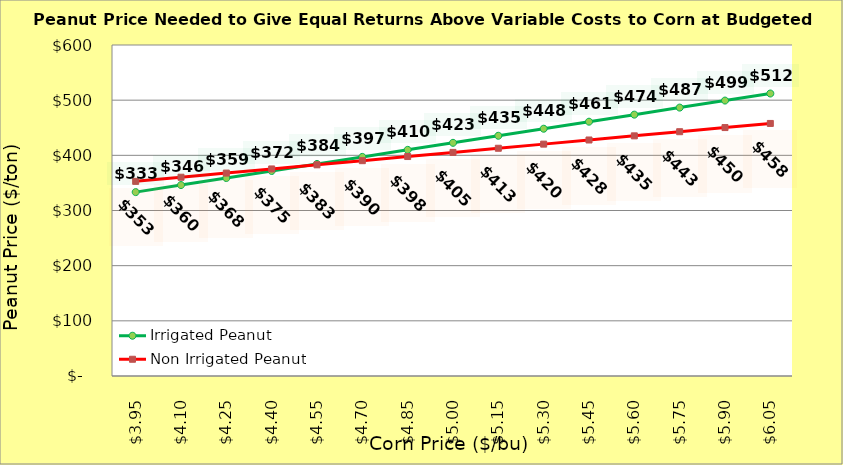
| Category | Irrigated Peanut | Non Irrigated Peanut |
|---|---|---|
| 3.949999999999998 | 333.333 | 352.817 |
| 4.099999999999998 | 346.099 | 360.317 |
| 4.249999999999998 | 358.865 | 367.817 |
| 4.399999999999999 | 371.631 | 375.317 |
| 4.549999999999999 | 384.397 | 382.817 |
| 4.699999999999999 | 397.163 | 390.317 |
| 4.85 | 409.929 | 397.817 |
| 5.0 | 422.695 | 405.317 |
| 5.15 | 435.461 | 412.817 |
| 5.300000000000001 | 448.227 | 420.317 |
| 5.450000000000001 | 460.993 | 427.817 |
| 5.600000000000001 | 473.759 | 435.317 |
| 5.750000000000002 | 486.525 | 442.817 |
| 5.900000000000002 | 499.291 | 450.317 |
| 6.0500000000000025 | 512.056 | 457.817 |